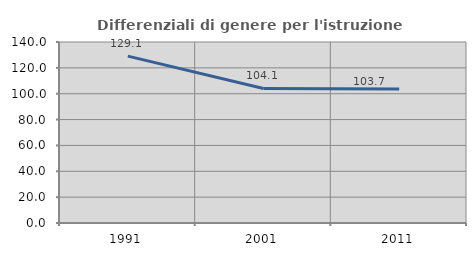
| Category | Differenziali di genere per l'istruzione superiore |
|---|---|
| 1991.0 | 129.081 |
| 2001.0 | 104.067 |
| 2011.0 | 103.721 |